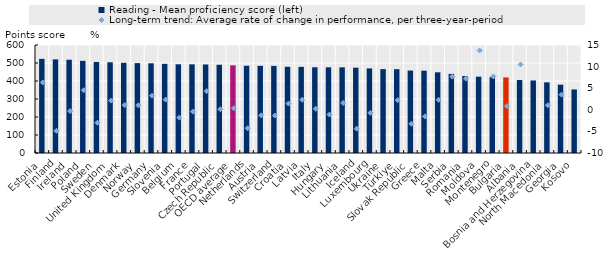
| Category | Reading - Mean proficiency score (left) |
|---|---|
| Estonia | 523.017 |
| Finland | 520.079 |
| Ireland | 518.078 |
| Poland | 511.856 |
| Sweden | 505.785 |
| United Kingdom | 503.928 |
| Denmark | 501.13 |
| Norway | 499.451 |
| Germany | 498.279 |
| Slovenia | 495.346 |
| Belgium | 492.864 |
| France | 492.606 |
| Portugal | 491.801 |
| Czech Republic | 490.219 |
| OECD average | 487.126 |
| Netherlands | 484.784 |
| Austria | 484.393 |
| Switzerland | 483.929 |
| Croatia | 478.989 |
| Latvia | 478.699 |
| Italy | 476.285 |
| Hungary | 475.987 |
| Lithuania | 475.873 |
| Iceland | 473.974 |
| Luxembourg | 469.985 |
| Ukraine | 465.95 |
| Türkiye | 465.632 |
| Slovak Republic | 457.984 |
| Greece | 457.414 |
| Malta | 448.235 |
| Serbia | 439.466 |
| Romania | 427.703 |
| Moldova | 423.993 |
| Montenegro | 421.058 |
| Bulgaria | 419.844 |
| Albania | 405.429 |
| Bosnia and Herzegovina | 402.978 |
| North Macedonia | 392.668 |
| Georgia | 379.753 |
| Kosovo | 353.065 |